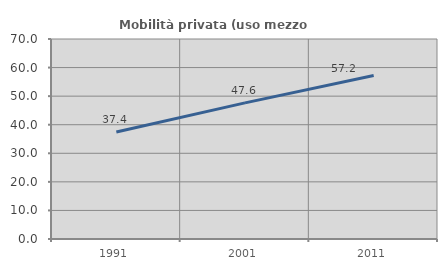
| Category | Mobilità privata (uso mezzo privato) |
|---|---|
| 1991.0 | 37.435 |
| 2001.0 | 47.649 |
| 2011.0 | 57.23 |